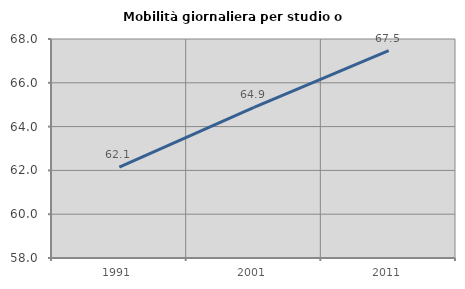
| Category | Mobilità giornaliera per studio o lavoro |
|---|---|
| 1991.0 | 62.148 |
| 2001.0 | 64.88 |
| 2011.0 | 67.465 |